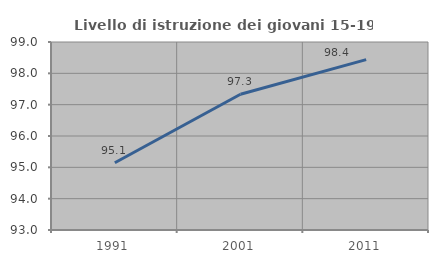
| Category | Livello di istruzione dei giovani 15-19 anni |
|---|---|
| 1991.0 | 95.146 |
| 2001.0 | 97.333 |
| 2011.0 | 98.438 |